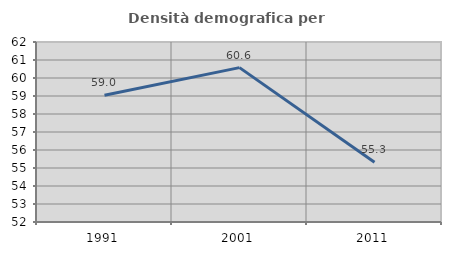
| Category | Densità demografica |
|---|---|
| 1991.0 | 59.039 |
| 2001.0 | 60.576 |
| 2011.0 | 55.325 |